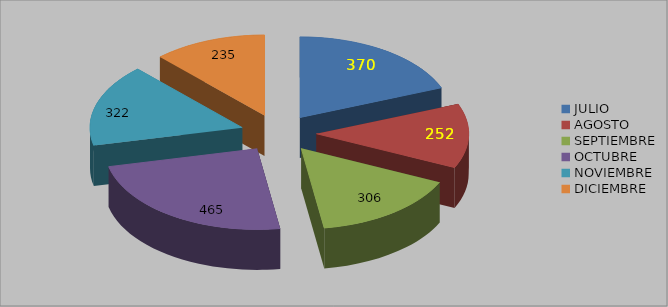
| Category |  ACTUALIZACIÓN DEL PORTAL SEGUNDO SEMESTRE 2014 |
|---|---|
| JULIO | 370 |
| AGOSTO | 252 |
| SEPTIEMBRE | 306 |
| OCTUBRE | 465 |
| NOVIEMBRE | 322 |
| DICIEMBRE | 235 |